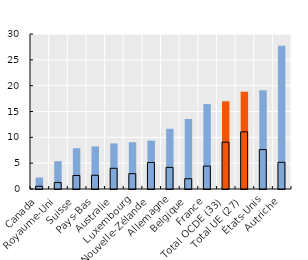
| Category | Nés à l’étranger | Nés dans le pays |
|---|---|---|
| Canada | 2.226 | 0.532 |
| Royaume-Uni | 5.379 | 1.241 |
| Suisse | 7.888 | 2.619 |
| Pays-Bas | 8.253 | 2.659 |
| Australie | 8.821 | 4.007 |
| Luxembourg | 9.041 | 2.969 |
| Nouvelle-Zélande | 9.365 | 5.127 |
| Allemagne | 11.652 | 4.183 |
| Belgique | 13.562 | 1.991 |
| France | 16.437 | 4.438 |
| Total OCDE (33) | 16.982 | 9.068 |
| Total UE (27) | 18.813 | 11.068 |
| États-Unis | 19.1 | 7.63 |
| Autriche | 27.728 | 5.166 |